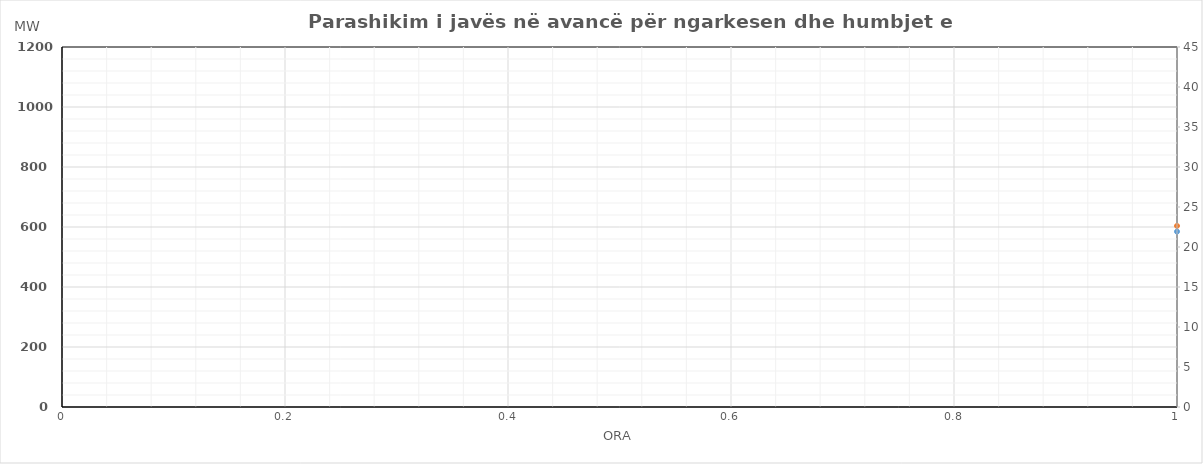
| Category | Ngarkesa (MWh) |
|---|---|
| 0 | 603.63 |
| 1 | 548.82 |
| 2 | 524.83 |
| 3 | 518.93 |
| 4 | 527.23 |
| 5 | 571.35 |
| 6 | 689.33 |
| 7 | 831.01 |
| 8 | 867.04 |
| 9 | 855.24 |
| 10 | 797.17 |
| 11 | 787.35 |
| 12 | 774.72 |
| 13 | 781.13 |
| 14 | 803.03 |
| 15 | 803.76 |
| 16 | 807.24 |
| 17 | 831.06 |
| 18 | 857.66 |
| 19 | 905 |
| 20 | 983.14 |
| 21 | 938.14 |
| 22 | 826.97 |
| 23 | 698.17 |
| 24 | 588.93 |
| 25 | 539.49 |
| 26 | 516.07 |
| 27 | 510.37 |
| 28 | 519.47 |
| 29 | 558.31 |
| 30 | 677.69 |
| 31 | 808.51 |
| 32 | 833.87 |
| 33 | 820.96 |
| 34 | 762.84 |
| 35 | 760.25 |
| 36 | 750.05 |
| 37 | 766.86 |
| 38 | 805.83 |
| 39 | 797.32 |
| 40 | 801.25 |
| 41 | 820.77 |
| 42 | 839.59 |
| 43 | 865.5 |
| 44 | 941.05 |
| 45 | 908.1 |
| 46 | 798.59 |
| 47 | 676.6 |
| 48 | 592.79 |
| 49 | 542.09 |
| 50 | 519.07 |
| 51 | 514.24 |
| 52 | 518.45 |
| 53 | 554.79 |
| 54 | 668.59 |
| 55 | 801.29 |
| 56 | 830.88 |
| 57 | 822.01 |
| 58 | 758.3 |
| 59 | 746.99 |
| 60 | 735.88 |
| 61 | 750.38 |
| 62 | 789.58 |
| 63 | 782.69 |
| 64 | 771.28 |
| 65 | 811.4 |
| 66 | 826.71 |
| 67 | 860.02 |
| 68 | 934.97 |
| 69 | 902.5 |
| 70 | 802.99 |
| 71 | 680.21 |
| 72 | 596.49 |
| 73 | 546.97 |
| 74 | 527.76 |
| 75 | 520.39 |
| 76 | 524.35 |
| 77 | 561.21 |
| 78 | 666.04 |
| 79 | 795.69 |
| 80 | 838.91 |
| 81 | 824.81 |
| 82 | 807.52 |
| 83 | 797.33 |
| 84 | 804.63 |
| 85 | 812.04 |
| 86 | 809.03 |
| 87 | 802.6 |
| 88 | 778.07 |
| 89 | 800.29 |
| 90 | 792.29 |
| 91 | 820.6 |
| 92 | 894.07 |
| 93 | 866.66 |
| 94 | 797.43 |
| 95 | 685.26 |
| 96 | 602.07 |
| 97 | 552.08 |
| 98 | 530.86 |
| 99 | 523.25 |
| 100 | 527.88 |
| 101 | 567.72 |
| 102 | 671.66 |
| 103 | 805.06 |
| 104 | 831.37 |
| 105 | 825.67 |
| 106 | 808.82 |
| 107 | 800.1 |
| 108 | 798.04 |
| 109 | 802.05 |
| 110 | 800.66 |
| 111 | 785.09 |
| 112 | 768.69 |
| 113 | 802.23 |
| 114 | 788.15 |
| 115 | 800.37 |
| 116 | 883.03 |
| 117 | 851.23 |
| 118 | 786.14 |
| 119 | 674.16 |
| 120 | 599.81 |
| 121 | 553.34 |
| 122 | 533.01 |
| 123 | 524.1 |
| 124 | 532.61 |
| 125 | 572.03 |
| 126 | 660.83 |
| 127 | 772.72 |
| 128 | 849.86 |
| 129 | 872.39 |
| 130 | 860.6 |
| 131 | 854.31 |
| 132 | 856.13 |
| 133 | 857.58 |
| 134 | 844.59 |
| 135 | 826.07 |
| 136 | 811.37 |
| 137 | 825.28 |
| 138 | 843.27 |
| 139 | 867.19 |
| 140 | 937.95 |
| 141 | 898.13 |
| 142 | 792.91 |
| 143 | 686.91 |
| 144 | 626.31 |
| 145 | 573.94 |
| 146 | 550.21 |
| 147 | 542.7 |
| 148 | 548.71 |
| 149 | 574.93 |
| 150 | 647.93 |
| 151 | 737.52 |
| 152 | 814.16 |
| 153 | 828.99 |
| 154 | 827.7 |
| 155 | 787.81 |
| 156 | 786.93 |
| 157 | 782.28 |
| 158 | 747.39 |
| 159 | 724.87 |
| 160 | 740.37 |
| 161 | 771.78 |
| 162 | 847.77 |
| 163 | 893.69 |
| 164 | 979.35 |
| 165 | 962.63 |
| 166 | 844.61 |
| 167 | 725.21 |